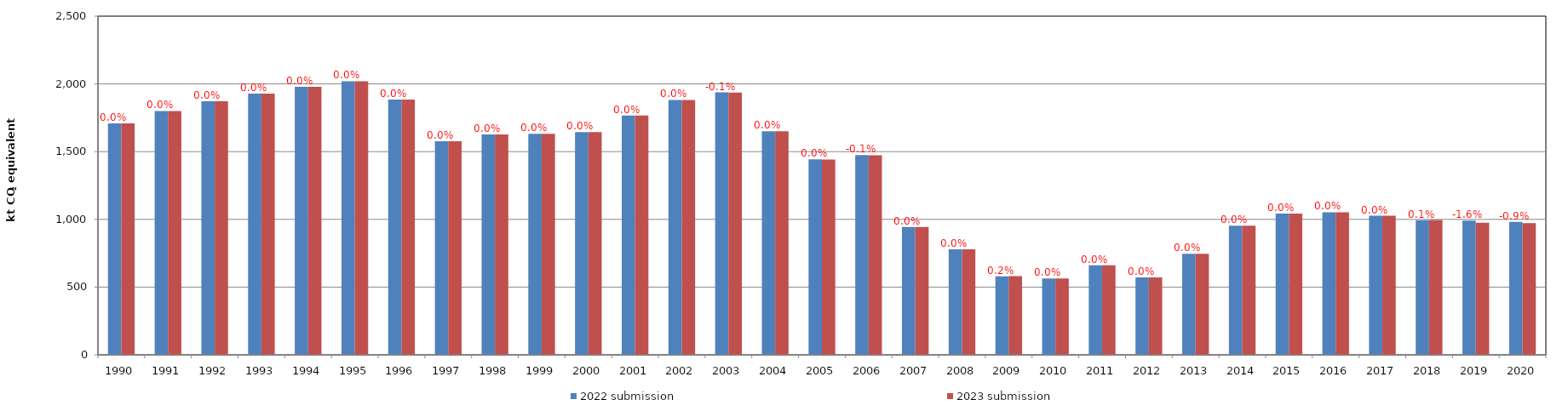
| Category | 2022 submission | 2023 submission |
|---|---|---|
| 1990.0 | 1709.238 | 1709.238 |
| 1991.0 | 1799.726 | 1799.726 |
| 1992.0 | 1872.611 | 1872.611 |
| 1993.0 | 1928.635 | 1928.635 |
| 1994.0 | 1978.886 | 1978.886 |
| 1995.0 | 2019.761 | 2019.761 |
| 1996.0 | 1884.463 | 1884.463 |
| 1997.0 | 1577.081 | 1577.081 |
| 1998.0 | 1626.696 | 1626.696 |
| 1999.0 | 1630.862 | 1630.862 |
| 2000.0 | 1643.385 | 1643.385 |
| 2001.0 | 1767.419 | 1766.968 |
| 2002.0 | 1881.438 | 1880.98 |
| 2003.0 | 1937.216 | 1935.886 |
| 2004.0 | 1650.693 | 1650.017 |
| 2005.0 | 1442.807 | 1442.324 |
| 2006.0 | 1473.964 | 1473.044 |
| 2007.0 | 943.037 | 943.257 |
| 2008.0 | 778.524 | 778.749 |
| 2009.0 | 579.628 | 580.613 |
| 2010.0 | 564.238 | 564.238 |
| 2011.0 | 660.895 | 660.895 |
| 2012.0 | 572.033 | 572.033 |
| 2013.0 | 745.875 | 745.875 |
| 2014.0 | 953.399 | 953.399 |
| 2015.0 | 1042.053 | 1042.053 |
| 2016.0 | 1052.212 | 1052.212 |
| 2017.0 | 1027 | 1027 |
| 2018.0 | 993.757 | 995.143 |
| 2019.0 | 991.414 | 975.669 |
| 2020.0 | 981.862 | 972.792 |